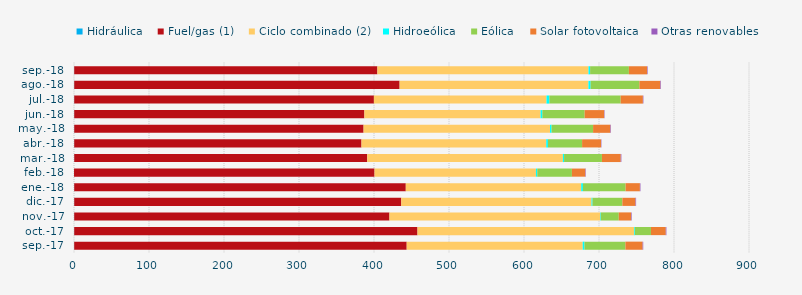
| Category | Hidráulica | Fuel/gas (1) | Ciclo combinado (2) | Hidroeólica | Eólica | Solar fotovoltaica | Otras renovables |
|---|---|---|---|---|---|---|---|
| sep.-17 | 0.268 | 443.341 | 234.655 | 2.337 | 54.609 | 22.973 | 0.802 |
| oct.-17 | 0.294 | 457.69 | 288.991 | 0.971 | 21.33 | 19.755 | 0.831 |
| nov.-17 | 0.274 | 420.327 | 280.938 | 0.791 | 24.032 | 16.484 | 0.803 |
| dic.-17 | 0.311 | 436.048 | 253.67 | 1.286 | 39.812 | 17.539 | 0.782 |
| ene.-18 | 0.279 | 442.105 | 233.902 | 2.258 | 56.908 | 19.063 | 0.762 |
| feb.-18 | 0.034 | 400.679 | 215.217 | 1.754 | 46.207 | 17.867 | 0.647 |
| mar.-18 | 0.31 | 390.68 | 260.839 | 1.6 | 50.498 | 25.081 | 0.837 |
| abr.-18 | 0.276 | 383.044 | 246.338 | 2.263 | 45.549 | 25.191 | 0.539 |
| may.-18 | 0.308 | 385.794 | 248.617 | 2.034 | 55.352 | 23.051 | 0.751 |
| jun.-18 | 0.294 | 386.903 | 234.948 | 2.322 | 56.421 | 25.993 | 0.531 |
| jul.-18 | 0.296 | 399.578 | 230.146 | 3.716 | 95.149 | 29.625 | 0.702 |
| ago.-18 | 0.308 | 433.847 | 251.789 | 2.859 | 65.078 | 27.842 | 0.816 |
| sep.-18 | 0.288 | 404.236 | 281.475 | 2.166 | 51.688 | 24.19 | 0.783 |